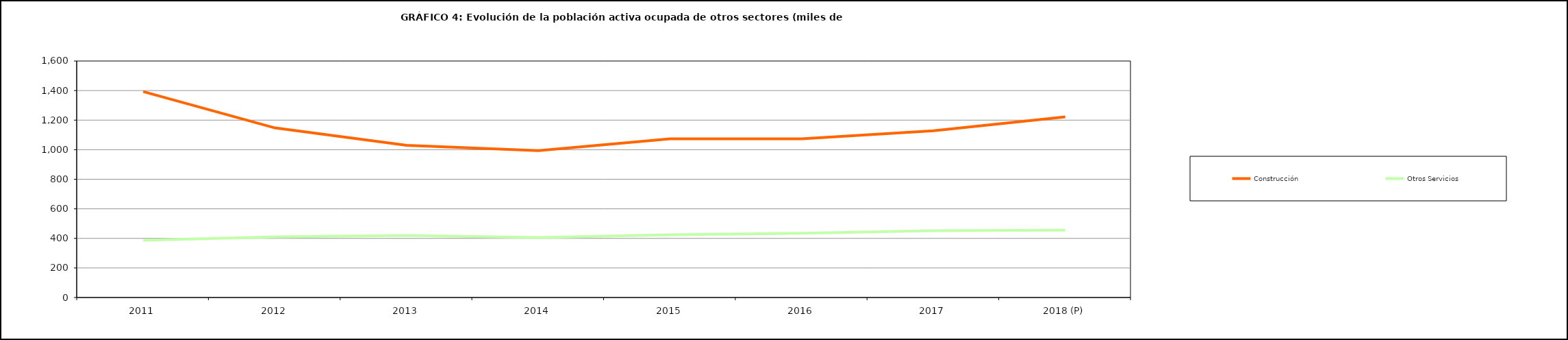
| Category | Construcción | Otros Servicios |
|---|---|---|
| 2011 | 1392.95 | 387.25 |
| 2012 | 1147.575 | 410.85 |
| 2013 | 1029.6 | 419.6 |
| 2014 | 993.5 | 405.475 |
| 2015 | 1073.65 | 424.325 |
| 2016 | 1073.9 | 434.6 |
| 2017 | 1128.3 | 452.7 |
| 2018 (P) | 1221.8 | 455.3 |